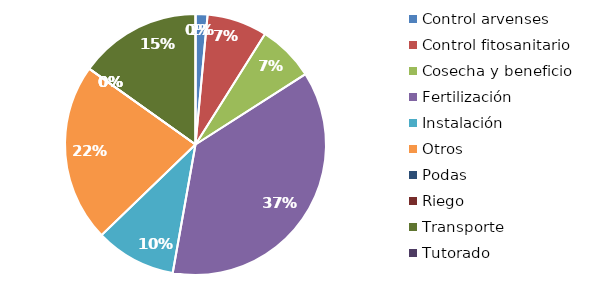
| Category | Valor |
|---|---|
| Control arvenses | 3074310 |
| Control fitosanitario | 15488190 |
| Cosecha y beneficio | 14566897.593 |
| Fertilización | 76597744 |
| Instalación | 20744482.436 |
| Otros | 45890640 |
| Podas | 0 |
| Riego | 0 |
| Transporte | 31462701 |
| Tutorado | 0 |